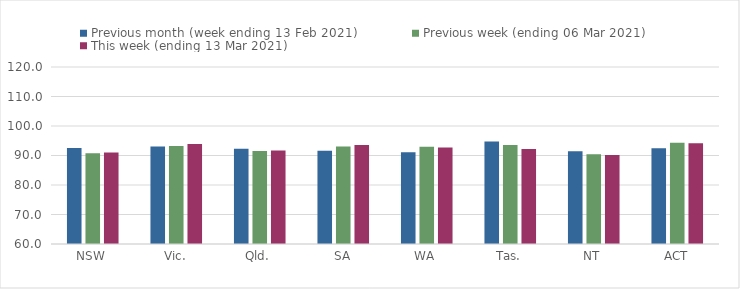
| Category | Previous month (week ending 13 Feb 2021) | Previous week (ending 06 Mar 2021) | This week (ending 13 Mar 2021) |
|---|---|---|---|
| NSW | 92.53 | 90.8 | 91.02 |
| Vic. | 93.09 | 93.19 | 93.86 |
| Qld. | 92.3 | 91.54 | 91.69 |
| SA | 91.62 | 93.05 | 93.59 |
| WA | 91.09 | 92.99 | 92.7 |
| Tas. | 94.71 | 93.56 | 92.23 |
| NT | 91.45 | 90.41 | 90.18 |
| ACT | 92.46 | 94.29 | 94.14 |